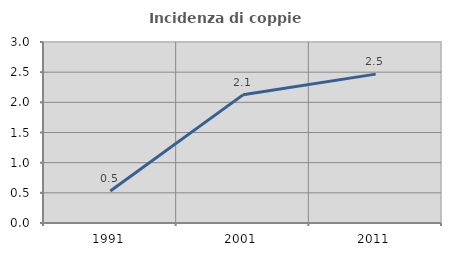
| Category | Incidenza di coppie miste |
|---|---|
| 1991.0 | 0.53 |
| 2001.0 | 2.124 |
| 2011.0 | 2.467 |